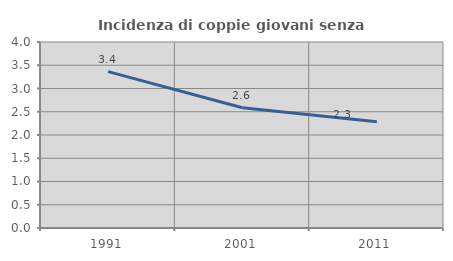
| Category | Incidenza di coppie giovani senza figli |
|---|---|
| 1991.0 | 3.363 |
| 2001.0 | 2.585 |
| 2011.0 | 2.284 |